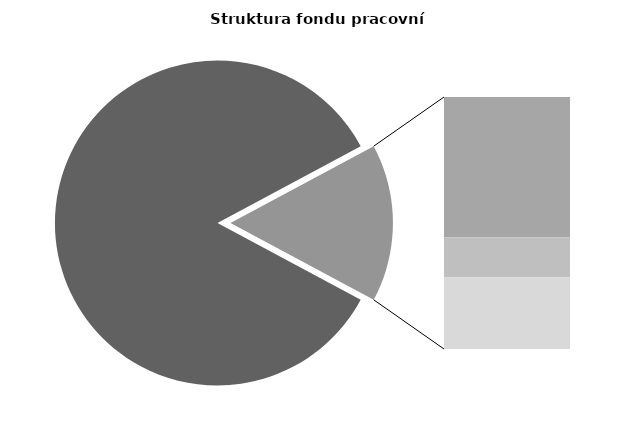
| Category | Series 0 |
|---|---|
| Průměrná měsíční odpracovaná doba bez přesčasu | 144.521 |
| Dovolená | 14.947 |
| Nemoc | 4.265 |
| Jiné | 7.645 |